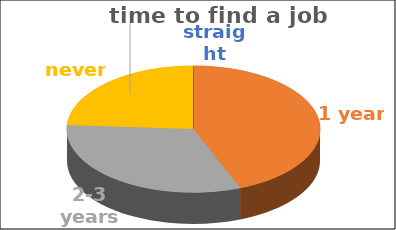
| Category | time to find a job | Series 1 | Series 2 | Series 3 | Series 4 |
|---|---|---|---|---|---|
| straight away | 0 |  |  |  |  |
| 1 year | 0.44 |  |  |  |  |
| 2-3 years | 0.32 |  |  |  |  |
| never | 0.24 |  |  |  |  |